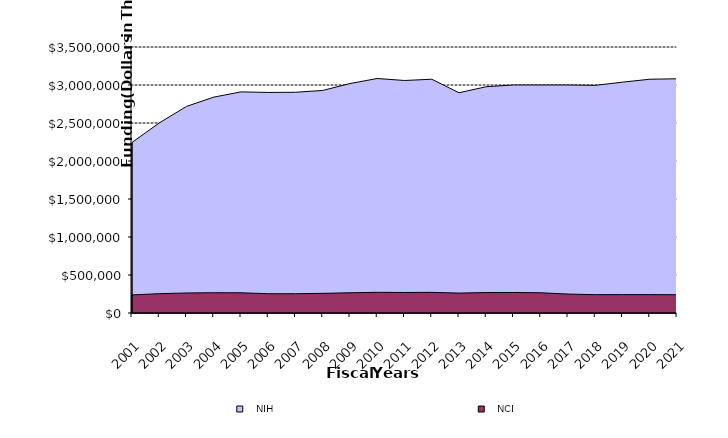
| Category |    NIH |    NCI |
|---|---|---|
| 2001.0 | 2244160 | 237789 |
| 2002.0 | 2500866 | 254396 |
| 2003.0 | 2718171 | 263442 |
| 2004.0 | 2840384 | 266975 |
| 2005.0 | 2909381 | 265907 |
| 2006.0 | 2902183 | 253666 |
| 2007.0 | 2904536 | 253666 |
| 2008.0 | 2928300 | 258499 |
| 2009.0 | 3019279 | 265882 |
| 2010.0 | 3085597 | 272130 |
| 2011.0 | 3059243 | 269953 |
| 2012.0 | 3076056 | 271692 |
| 2013.0 | 2897865 | 261550 |
| 2014.0 | 2977579 | 269212 |
| 2015.0 | 3000061 | 269660 |
| 2016.0 | 3000061 | 266422 |
| 2017.0 | 3000061 | 249019 |
| 2018.0 | 2995381 | 241234 |
| 2019.0 | 3037300 | 241979 |
| 2020.0 | 3076061 | 241975 |
| 2021.0 | 3081897 | 240513 |